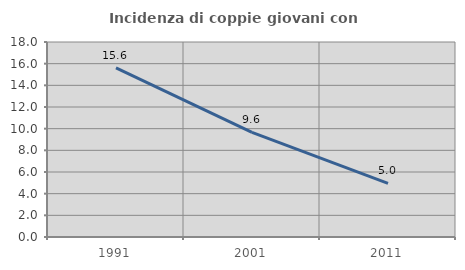
| Category | Incidenza di coppie giovani con figli |
|---|---|
| 1991.0 | 15.603 |
| 2001.0 | 9.649 |
| 2011.0 | 4.95 |